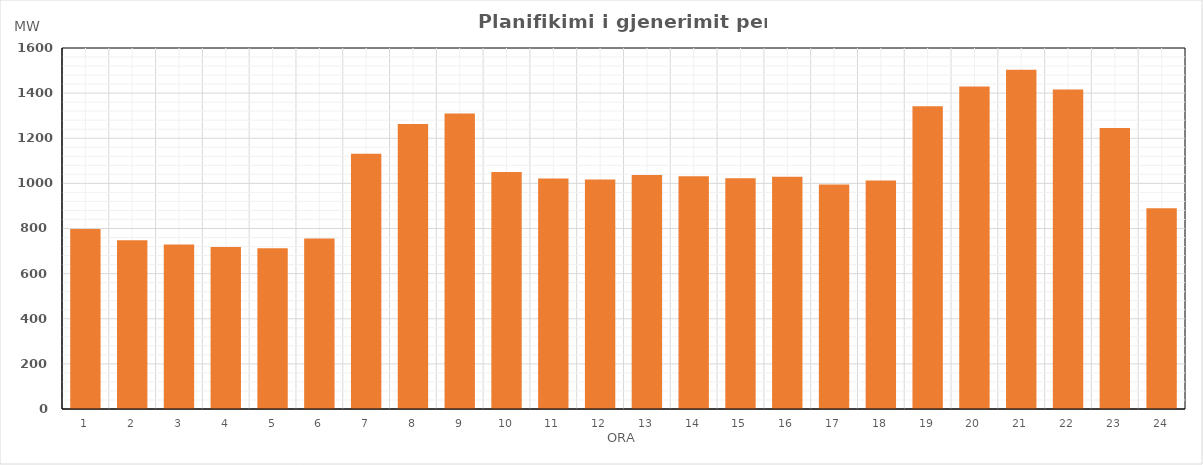
| Category | Max (MW) |
|---|---|
| 0 | 797.49 |
| 1 | 747.97 |
| 2 | 728.76 |
| 3 | 718.39 |
| 4 | 712.35 |
| 5 | 755.21 |
| 6 | 1131.04 |
| 7 | 1263.69 |
| 8 | 1309.91 |
| 9 | 1050.81 |
| 10 | 1021.52 |
| 11 | 1017.33 |
| 12 | 1037.63 |
| 13 | 1031.04 |
| 14 | 1023.03 |
| 15 | 1029.6 |
| 16 | 995.07 |
| 17 | 1013.29 |
| 18 | 1342.29 |
| 19 | 1429.6 |
| 20 | 1503.07 |
| 21 | 1415.66 |
| 22 | 1245.43 |
| 23 | 890.26 |